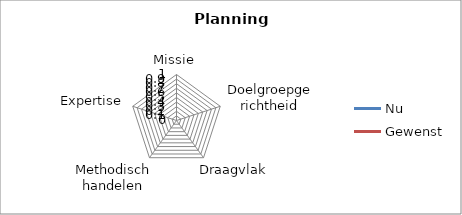
| Category | Nu | Gewenst |
|---|---|---|
| Missie | 0 | 0 |
| Doelgroepgerichtheid | 0 | 0 |
| Draagvlak | 0 | 0 |
| Methodisch handelen | 0 | 0 |
| Expertise | 0 | 0 |